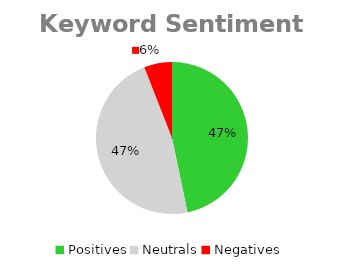
| Category | Keyword Sentiment Total |
|---|---|
| Positives | 670 |
| Neutrals | 679 |
| Negatives | 85 |